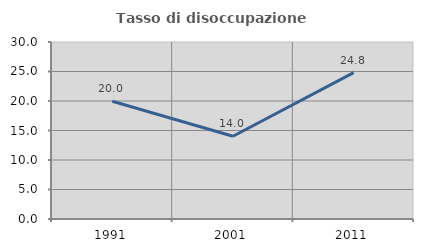
| Category | Tasso di disoccupazione giovanile  |
|---|---|
| 1991.0 | 19.961 |
| 2001.0 | 14.03 |
| 2011.0 | 24.797 |